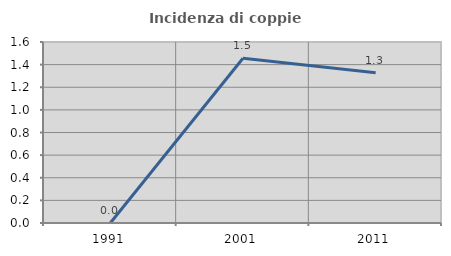
| Category | Incidenza di coppie miste |
|---|---|
| 1991.0 | 0 |
| 2001.0 | 1.456 |
| 2011.0 | 1.329 |